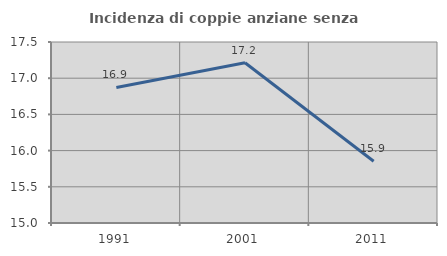
| Category | Incidenza di coppie anziane senza figli  |
|---|---|
| 1991.0 | 16.872 |
| 2001.0 | 17.213 |
| 2011.0 | 15.854 |